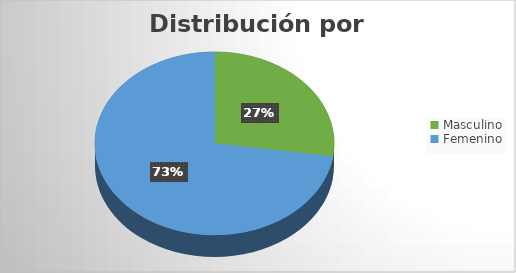
| Category | Series 0 |
|---|---|
| Masculino | 60 |
| Femenino  | 160 |